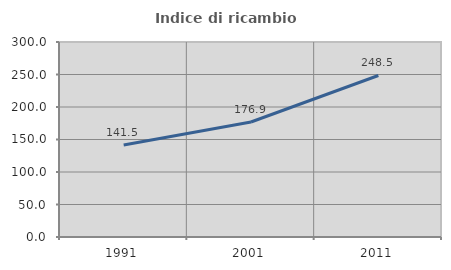
| Category | Indice di ricambio occupazionale  |
|---|---|
| 1991.0 | 141.534 |
| 2001.0 | 176.898 |
| 2011.0 | 248.485 |